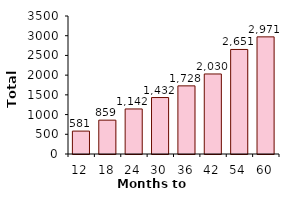
| Category | Interest |
|---|---|
| 12.0 | 580.841 |
| 18.0 | 858.548 |
| 24.0 | 1142.319 |
| 30.0 | 1432.132 |
| 36.0 | 1727.96 |
| 42.0 | 2029.772 |
| 54.0 | 2651.194 |
| 60.0 | 2970.713 |